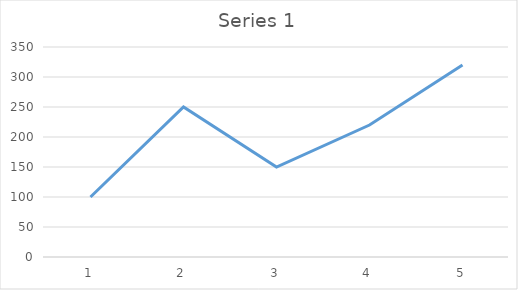
| Category | Series 1 |
|---|---|
| 0 | 100 |
| 1 | 250 |
| 2 | 150 |
| 3 | 220 |
| 4 | 320 |